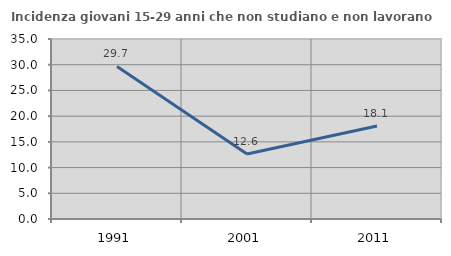
| Category | Incidenza giovani 15-29 anni che non studiano e non lavorano  |
|---|---|
| 1991.0 | 29.661 |
| 2001.0 | 12.628 |
| 2011.0 | 18.081 |